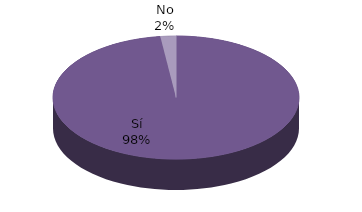
| Category | Series 1 |
|---|---|
| Sí | 96 |
| No | 2 |